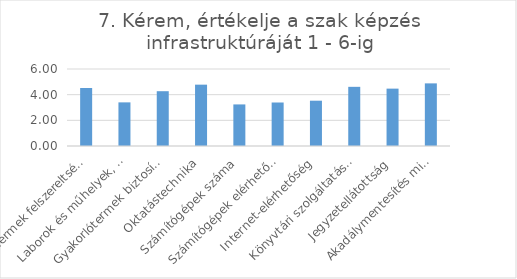
| Category | Series 0 |
|---|---|
| Tantermek felszereltsége | 4.52 |
| Laborok és műhelyek, műtermek felszereltsége | 3.4 |
| Gyakorlótermek biztosítása | 4.27 |
| Oktatástechnika | 4.78 |
| Számítógépek száma | 3.24 |
| Számítógépek elérhetősége | 3.39 |
| Internet-elérhetőség | 3.53 |
| Könyvtári szolgáltatások | 4.61 |
| Jegyzetellátottság | 4.47 |
| Akadálymentesítés minősége | 4.88 |